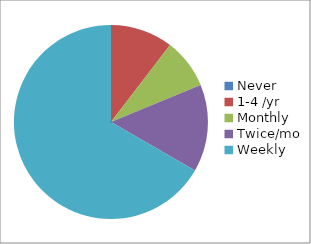
| Category | Series 0 |
|---|---|
| Never | 0 |
| 1-4 /yr | 5 |
| Monthly | 4 |
| Twice/mo | 7 |
| Weekly | 32 |